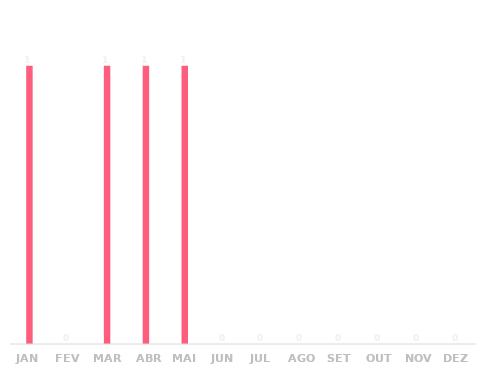
| Category | Series 0 |
|---|---|
| JAN | 1 |
| FEV | 0 |
| MAR | 1 |
| ABR | 1 |
| MAI | 1 |
| JUN | 0 |
| JUL | 0 |
| AGO | 0 |
| SET | 0 |
| OUT | 0 |
| NOV | 0 |
| DEZ | 0 |